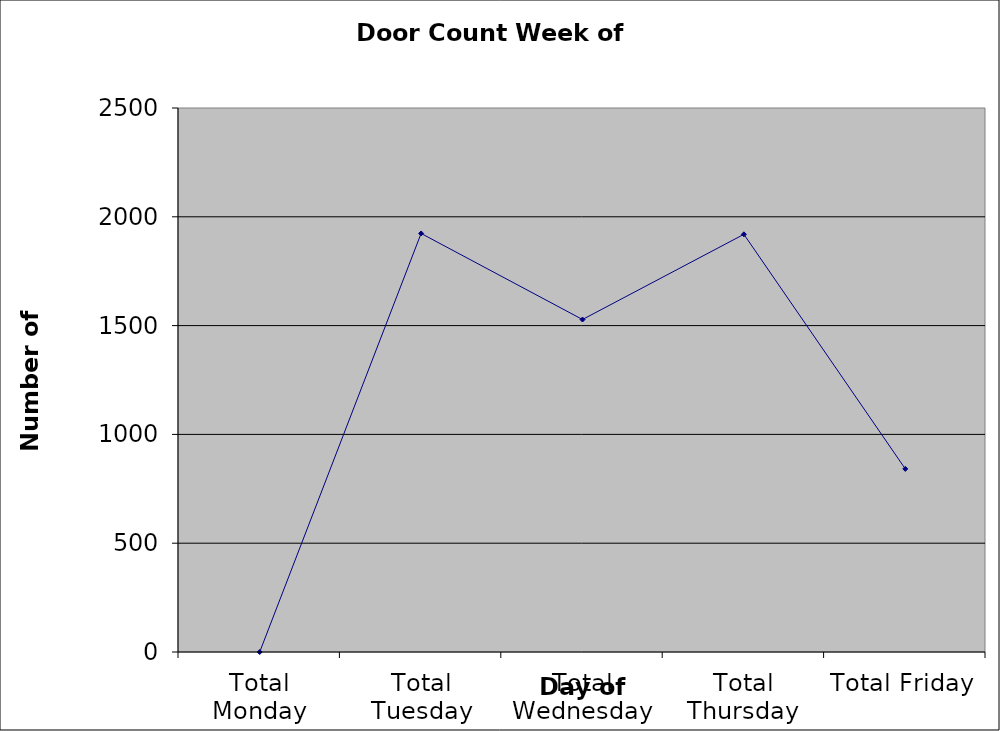
| Category | Series 0 |
|---|---|
| Total Monday | 0 |
| Total Tuesday | 1923.5 |
| Total Wednesday | 1528 |
| Total Thursday | 1919.5 |
| Total Friday | 841.5 |